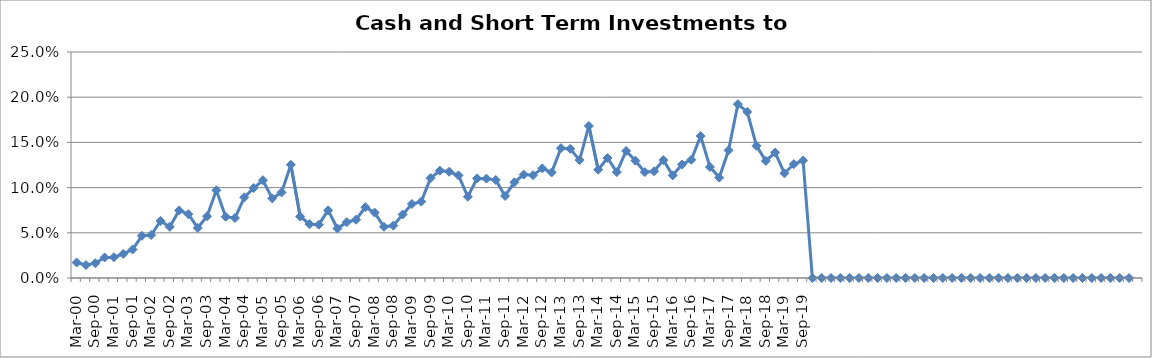
| Category | Cash and Short-Term Investments to Revenue % |
|---|---|
| Mar-00 | 0.017 |
| Jun-00 | 0.014 |
| Sep-00 | 0.016 |
| Dec-00 | 0.023 |
| Mar-01 | 0.023 |
| Jun-01 | 0.027 |
| Sep-01 | 0.032 |
| Dec-01 | 0.047 |
| Mar-02 | 0.048 |
| Jun-02 | 0.063 |
| Sep-02 | 0.057 |
| Dec-02 | 0.075 |
| Mar-03 | 0.071 |
| Jun-03 | 0.055 |
| Sep-03 | 0.068 |
| Dec-03 | 0.097 |
| Mar-04 | 0.068 |
| Jun-04 | 0.066 |
| Sep-04 | 0.089 |
| Dec-04 | 0.1 |
| Mar-05 | 0.108 |
| Jun-05 | 0.088 |
| Sep-05 | 0.095 |
| Dec-05 | 0.125 |
| Mar-06 | 0.068 |
| Jun-06 | 0.06 |
| Sep-06 | 0.059 |
| Dec-06 | 0.075 |
| Mar-07 | 0.055 |
| Jun-07 | 0.062 |
| Sep-07 | 0.064 |
| Dec-07 | 0.078 |
| Mar-08 | 0.072 |
| Jun-08 | 0.057 |
| Sep-08 | 0.058 |
| Dec-08 | 0.07 |
| Mar-09 | 0.082 |
| Jun-09 | 0.085 |
| Sep-09 | 0.11 |
| Dec-09 | 0.119 |
| Mar-10 | 0.118 |
| Jun-10 | 0.113 |
| Sep-10 | 0.09 |
| Dec-10 | 0.11 |
| Mar-11 | 0.11 |
| Jun-11 | 0.108 |
| Sep-11 | 0.091 |
| Dec-11 | 0.106 |
| Mar-12 | 0.114 |
| Jun-12 | 0.114 |
| Sep-12 | 0.121 |
| Dec-12 | 0.117 |
| Mar-13 | 0.144 |
| Jun-13 | 0.143 |
| Sep-13 | 0.13 |
| Dec-13 | 0.168 |
| Mar-14 | 0.12 |
| Jun-14 | 0.133 |
| Sep-14 | 0.117 |
| Dec-14 | 0.141 |
| Mar-15 | 0.13 |
| Jun-15 | 0.117 |
| Sep-15 | 0.118 |
| Dec-15 | 0.13 |
| Mar-16 | 0.114 |
| Jun-16 | 0.126 |
| Sep-16 | 0.131 |
| Dec-16 | 0.157 |
| Mar-17 | 0.123 |
| Jun-17 | 0.111 |
| Sep-17 | 0.141 |
| Dec-17 | 0.192 |
| Mar-18 | 0.184 |
| Jun-18 | 0.146 |
| Sep-18 | 0.129 |
| Dec-18 | 0.139 |
| Mar-19 | 0.116 |
| Jun-19 | 0.126 |
| Sep-19 | 0.13 |